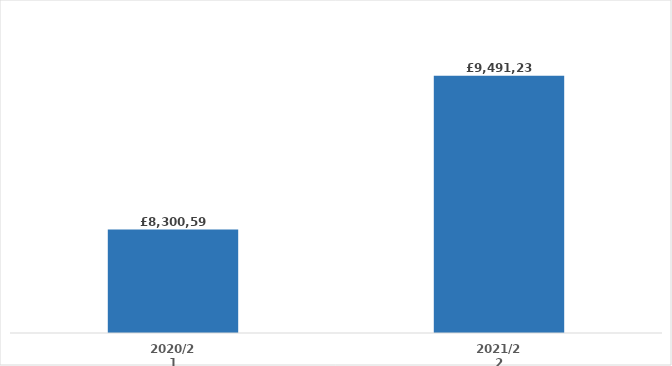
| Category | Series 0 |
|---|---|
| 2020/21 | 8300597.665 |
| 2021/22 | 9491231.005 |